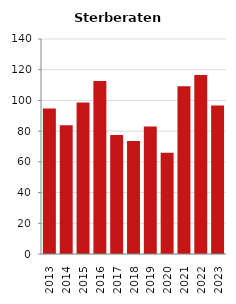
| Category | Sterberate der Bevölkerung ab 80 Jahre (auf Tsd.) |
|---|---|
| 2013.0 | 94.737 |
| 2014.0 | 83.916 |
| 2015.0 | 98.639 |
| 2016.0 | 112.628 |
| 2017.0 | 77.441 |
| 2018.0 | 73.579 |
| 2019.0 | 83.056 |
| 2020.0 | 66.007 |
| 2021.0 | 109.215 |
| 2022.0 | 116.608 |
| 2023.0 | 96.654 |